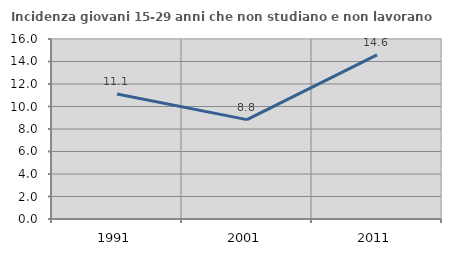
| Category | Incidenza giovani 15-29 anni che non studiano e non lavorano  |
|---|---|
| 1991.0 | 11.111 |
| 2001.0 | 8.835 |
| 2011.0 | 14.589 |